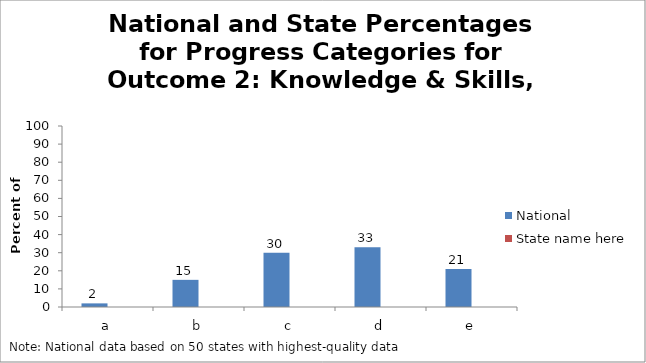
| Category | National | State name here |
|---|---|---|
| a | 2 |  |
| b | 15 |  |
| c | 30 |  |
| d | 33 |  |
| e | 21 |  |